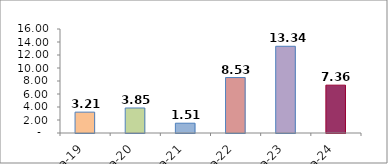
| Category | Series 0 |
|---|---|
| Ema-19 | 3.21 |
| Ema-20 | 3.848 |
| Ema-21 | 1.507 |
| Ema-22 | 8.532 |
| Ema-23 | 13.341 |
| Ema-24 | 7.359 |